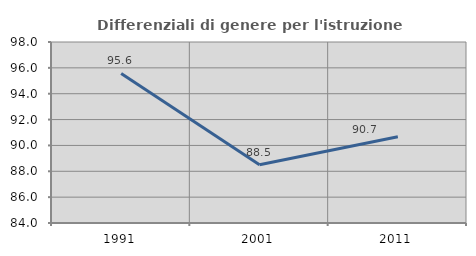
| Category | Differenziali di genere per l'istruzione superiore |
|---|---|
| 1991.0 | 95.569 |
| 2001.0 | 88.501 |
| 2011.0 | 90.677 |